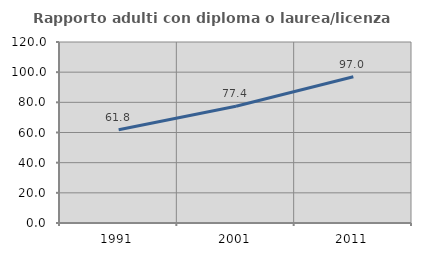
| Category | Rapporto adulti con diploma o laurea/licenza media  |
|---|---|
| 1991.0 | 61.814 |
| 2001.0 | 77.439 |
| 2011.0 | 96.982 |